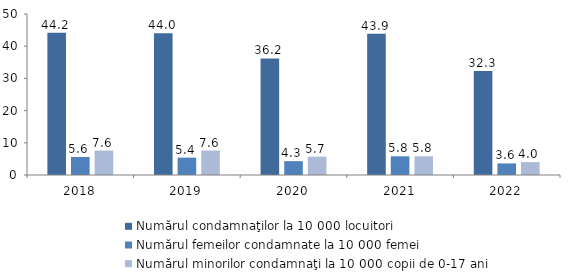
| Category | Numărul condamnaţilor la 10 000 locuitori | Numărul femeilor condamnate la 10 000 femei | Numărul minorilor condamnaţi la 10 000 copii de 0-17 ani |
|---|---|---|---|
| 2018.0 | 44.2 | 5.6 | 7.6 |
| 2019.0 | 44 | 5.4 | 7.6 |
| 2020.0 | 36.2 | 4.3 | 5.7 |
| 2021.0 | 43.9 | 5.8 | 5.8 |
| 2022.0 | 32.3 | 3.6 | 4 |